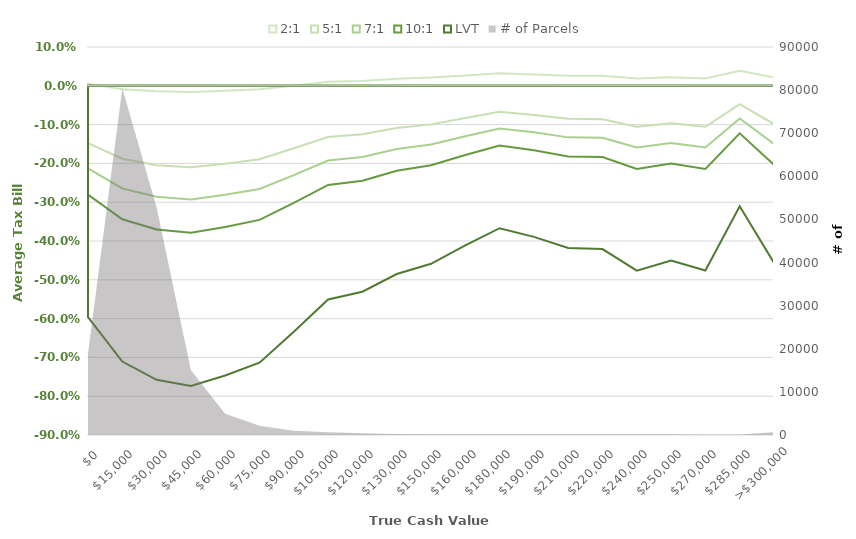
| Category | 2:1 | 5:1 | 7:1 | 10:1 | LVT |
|---|---|---|---|---|---|
| $0  | 0.005 | -0.148 | -0.213 | -0.281 | -0.596 |
| $15,000  | -0.009 | -0.188 | -0.265 | -0.344 | -0.711 |
| $30,000  | -0.014 | -0.205 | -0.286 | -0.37 | -0.758 |
| $45,000  | -0.016 | -0.21 | -0.293 | -0.379 | -0.774 |
| $60,000  | -0.013 | -0.201 | -0.281 | -0.364 | -0.747 |
| $75,000  | -0.009 | -0.189 | -0.266 | -0.346 | -0.713 |
| $90,000  | 0 | -0.161 | -0.23 | -0.302 | -0.634 |
| $105,000  | 0.01 | -0.132 | -0.193 | -0.256 | -0.551 |
| $120,000  | 0.013 | -0.125 | -0.184 | -0.244 | -0.531 |
| $130,000  | 0.018 | -0.109 | -0.163 | -0.219 | -0.485 |
| $150,000  | 0.021 | -0.099 | -0.151 | -0.205 | -0.459 |
| $160,000  | 0.027 | -0.083 | -0.13 | -0.178 | -0.411 |
| $180,000  | 0.032 | -0.067 | -0.11 | -0.154 | -0.367 |
| $190,000  | 0.029 | -0.075 | -0.12 | -0.166 | -0.389 |
| $210,000  | 0.026 | -0.085 | -0.133 | -0.182 | -0.418 |
| $220,000  | 0.026 | -0.086 | -0.134 | -0.184 | -0.421 |
| $240,000  | 0.019 | -0.106 | -0.159 | -0.214 | -0.476 |
| $250,000  | 0.022 | -0.097 | -0.148 | -0.2 | -0.451 |
| $270,000  | 0.019 | -0.106 | -0.159 | -0.214 | -0.476 |
| $285,000  | 0.039 | -0.047 | -0.084 | -0.123 | -0.31 |
| >$300,000 | 0.021 | -0.099 | -0.15 | -0.203 | -0.457 |